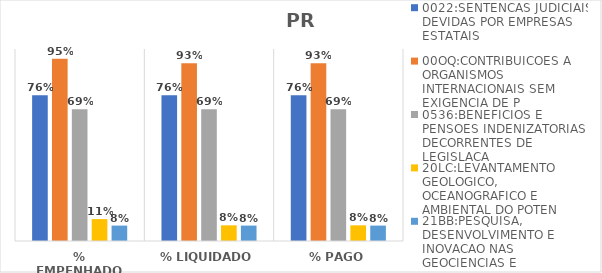
| Category | 0022:SENTENCAS JUDICIAIS DEVIDAS POR EMPRESAS ESTATAIS | 00OQ:CONTRIBUICOES A ORGANISMOS INTERNACIONAIS SEM EXIGENCIA DE P | 0536:BENEFICIOS E PENSOES INDENIZATORIAS DECORRENTES DE LEGISLACA | 20LC:LEVANTAMENTO GEOLOGICO, OCEANOGRAFICO E AMBIENTAL DO POTEN | 21BB:PESQUISA, DESENVOLVIMENTO E INOVACAO NAS GEOCIENCIAS E |
|---|---|---|---|---|---|
| % EMPENHADO | 0.759 | 0.95 | 0.687 | 0.114 | 0.08 |
| % LIQUIDADO | 0.759 | 0.926 | 0.687 | 0.082 | 0.08 |
| % PAGO | 0.759 | 0.926 | 0.687 | 0.082 | 0.08 |